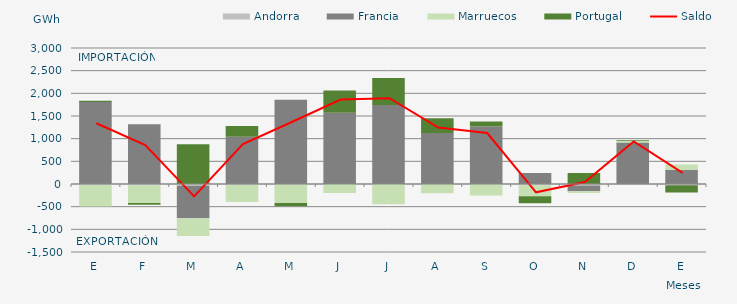
| Category | Andorra | Francia | Marruecos | Portugal |
|---|---|---|---|---|
| E | -24.796 | 1810.619 | -470.016 | 24.492 |
| F | -25.31 | 1316.02 | -393.308 | -40.299 |
| M | -38.757 | -716.099 | -394.27 | 875.503 |
| A | -19.567 | 1043.23 | -378.646 | 237.582 |
| M | -12.003 | 1858.226 | -405.06 | -72.803 |
| J | -0.136 | 1569.713 | -200.627 | 495.014 |
| J | -0.226 | 1742.725 | -445.987 | 597.215 |
| A | -4.615 | 1125.357 | -201.623 | 324.903 |
| S | -3.339 | 1270.11 | -251.758 | 109.449 |
| O | -26.446 | 240.099 | -243.372 | -152.75 |
| N | -30.553 | -129.248 | -36.387 | 240.868 |
| D | -24.685 | 915.885 | 32.032 | 15.954 |
| E | -26.717 | 310.511 | 121.876 | -159.316 |